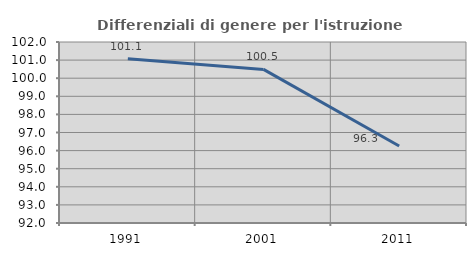
| Category | Differenziali di genere per l'istruzione superiore |
|---|---|
| 1991.0 | 101.071 |
| 2001.0 | 100.486 |
| 2011.0 | 96.256 |